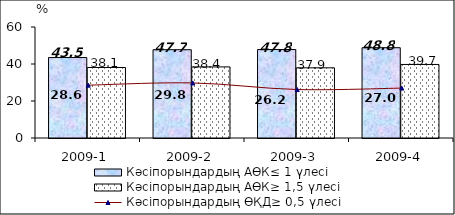
| Category | Кәсіпорындардың АӨК≤ 1 үлесі | Кәсіпорындардың АӨК≥ 1,5 үлесі |
|---|---|---|
| 2009-1 | 43.493 | 38.111 |
| 2009-2 | 47.722 | 38.426 |
| 2009-3 | 47.811 | 37.935 |
| 2009-4 | 48.803 | 39.749 |